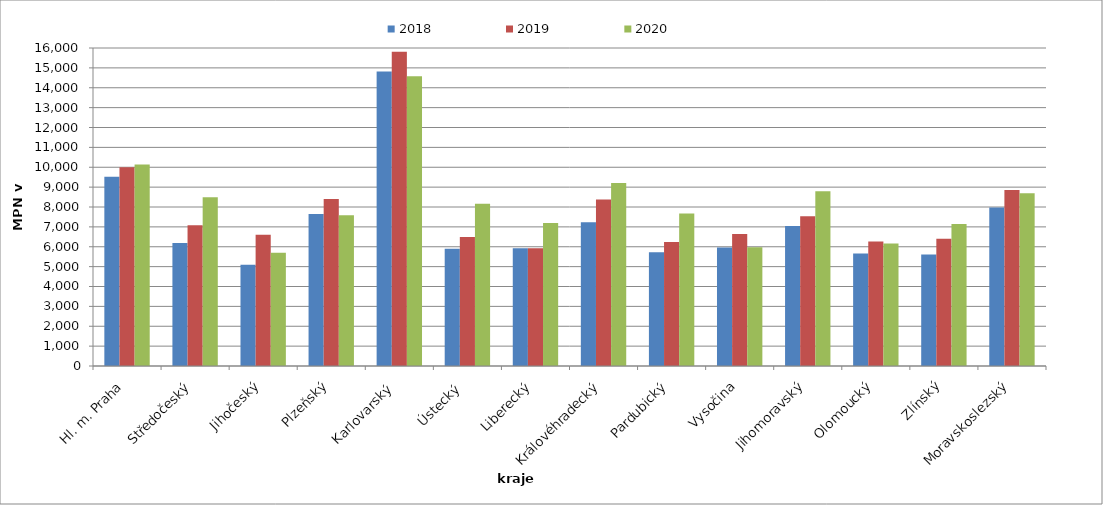
| Category | 2018 | 2019 | 2020 |
|---|---|---|---|
| Hl. m. Praha | 9528 | 10002.286 | 10140.043 |
| Středočeský | 6183.902 | 7077.522 | 8485.2 |
| Jihočeský | 5092.318 | 6601.722 | 5695.028 |
| Plzeňský | 7646.8 | 8408 | 7587 |
| Karlovarský  | 14813.793 | 15806.897 | 14580 |
| Ústecký   | 5905.243 | 6495.652 | 8168.556 |
| Liberecký | 5923.061 | 5923.061 | 7195.196 |
| Královéhradecký | 7234.58 | 8377.465 | 9205.72 |
| Pardubický | 5721.681 | 6238.655 | 7676.386 |
| Vysočina | 5960.301 | 6645.654 | 5975.429 |
| Jihomoravský | 7047.818 | 7531.309 | 8788.295 |
| Olomoucký | 5665.037 | 6259.92 | 6159.3 |
| Zlínský | 5613.642 | 6399.191 | 7149.711 |
| Moravskoslezský | 7980.648 | 8860.439 | 8687.415 |